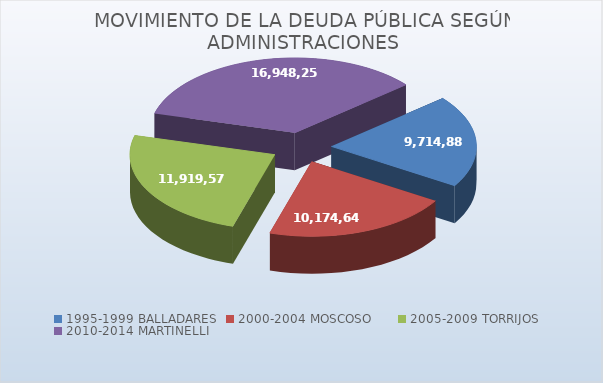
| Category | NUEVAS OBLIGACIONES | AMORTIZACIONES |
|---|---|---|
| 0 | 9714881 | 7391108 |
| 1 | 10174646 | 7813666 |
| 2 | 11919574 | 10935323 |
| 3 | 16948250.309 | 9549160.637 |